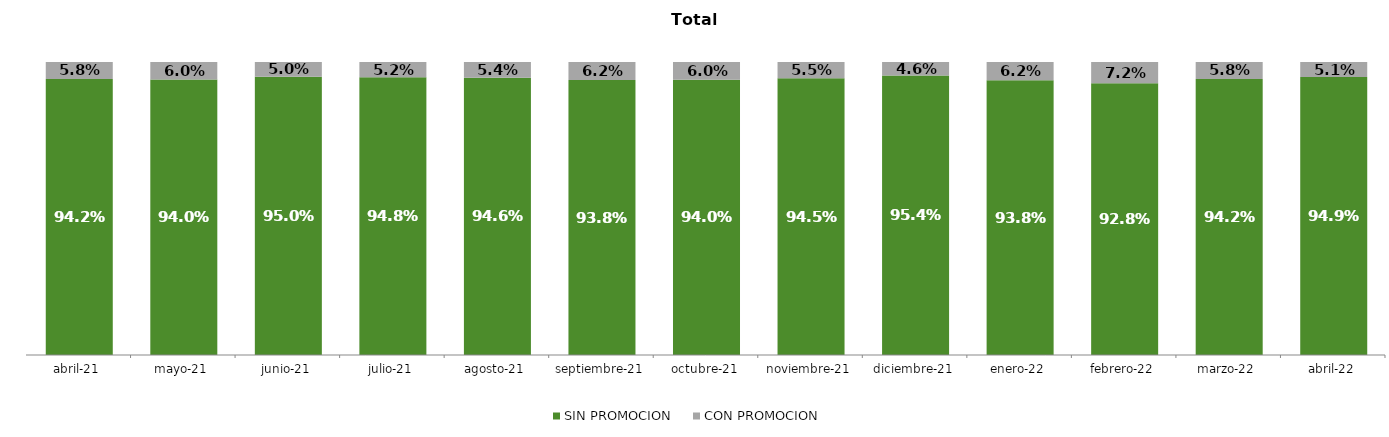
| Category | SIN PROMOCION   | CON PROMOCION   |
|---|---|---|
| 2021-04-01 | 0.942 | 0.058 |
| 2021-05-01 | 0.94 | 0.06 |
| 2021-06-01 | 0.95 | 0.05 |
| 2021-07-01 | 0.948 | 0.052 |
| 2021-08-01 | 0.946 | 0.054 |
| 2021-09-01 | 0.938 | 0.062 |
| 2021-10-01 | 0.94 | 0.06 |
| 2021-11-01 | 0.945 | 0.055 |
| 2021-12-01 | 0.954 | 0.046 |
| 2022-01-01 | 0.938 | 0.062 |
| 2022-02-01 | 0.928 | 0.072 |
| 2022-03-01 | 0.942 | 0.058 |
| 2022-04-01 | 0.949 | 0.051 |